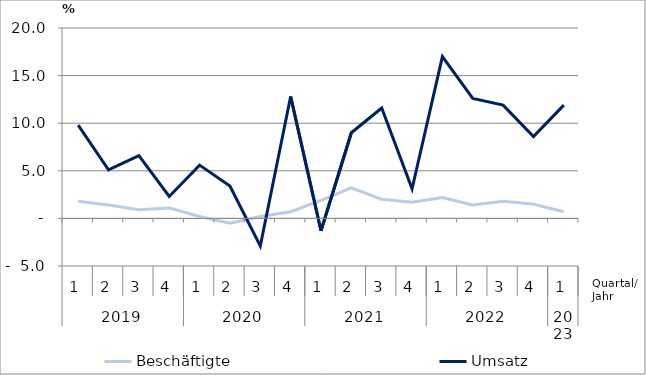
| Category | Beschäftigte | Umsatz |
|---|---|---|
| 0 | 1.8 | 9.8 |
| 1 | 1.4 | 5.1 |
| 2 | 0.9 | 6.6 |
| 3 | 1.1 | 2.3 |
| 4 | 0.2 | 5.6 |
| 5 | -0.5 | 3.4 |
| 6 | 0.2 | -2.9 |
| 7 | 0.7 | 12.8 |
| 8 | 1.9 | -1.3 |
| 9 | 3.2 | 9 |
| 10 | 2 | 11.6 |
| 11 | 1.7 | 3.1 |
| 12 | 2.2 | 17 |
| 13 | 1.4 | 12.6 |
| 14 | 1.8 | 11.9 |
| 15 | 1.5 | 8.6 |
| 16 | 0.7 | 11.9 |